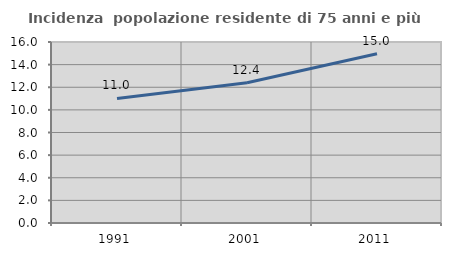
| Category | Incidenza  popolazione residente di 75 anni e più |
|---|---|
| 1991.0 | 11.007 |
| 2001.0 | 12.398 |
| 2011.0 | 14.954 |